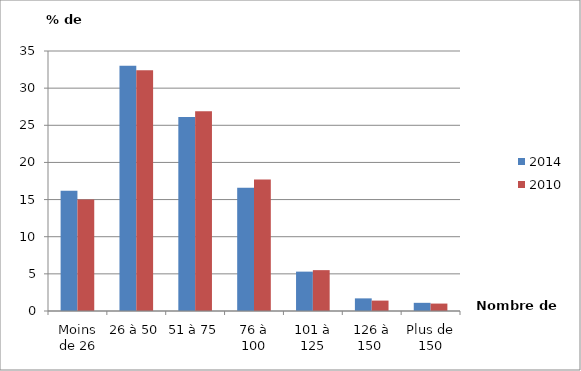
| Category | 2014 | 2010 |
|---|---|---|
| Moins de 26 | 16.2 | 15 |
| 26 à 50 | 33 | 32.4 |
| 51 à 75 | 26.1 | 26.9 |
| 76 à 100 | 16.6 | 17.7 |
| 101 à 125 | 5.3 | 5.5 |
| 126 à 150  | 1.7 | 1.4 |
| Plus de 150 | 1.1 | 1 |